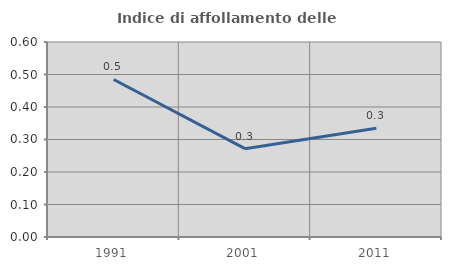
| Category | Indice di affollamento delle abitazioni  |
|---|---|
| 1991.0 | 0.485 |
| 2001.0 | 0.272 |
| 2011.0 | 0.334 |